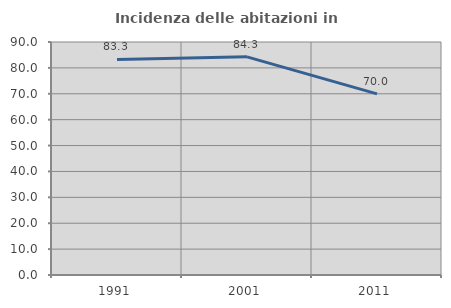
| Category | Incidenza delle abitazioni in proprietà  |
|---|---|
| 1991.0 | 83.26 |
| 2001.0 | 84.258 |
| 2011.0 | 69.984 |